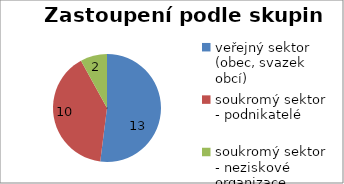
| Category | Zastoupení podle skupin MAS |
|---|---|
| veřejný sektor (obec, svazek obcí) | 13 |
| soukromý sektor - podnikatelé  | 10 |
| soukromý sektor - neziskové organizace | 2 |